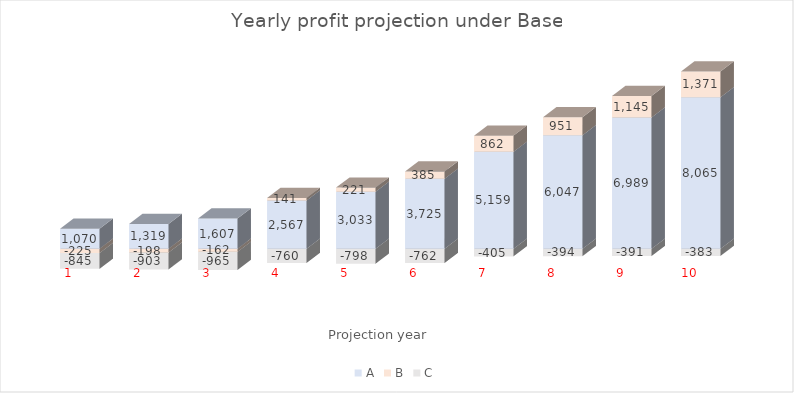
| Category | A | B | C |
|---|---|---|---|
| 1.0 | 1070 | -225 | -845 |
| 2.0 | 1318.6 | -197.5 | -903.1 |
| 3.0 | 1606.846 | -162.465 | -965.281 |
| 4.0 | 2566.912 | 140.976 | -759.968 |
| 5.0 | 3033.17 | 221.092 | -798.205 |
| 6.0 | 3724.704 | 385.331 | -761.931 |
| 7.0 | 5158.934 | 861.983 | -405.261 |
| 8.0 | 6047.113 | 950.805 | -393.509 |
| 9.0 | 6988.613 | 1145.164 | -390.745 |
| 10.0 | 8065.15 | 1370.845 | -383.07 |